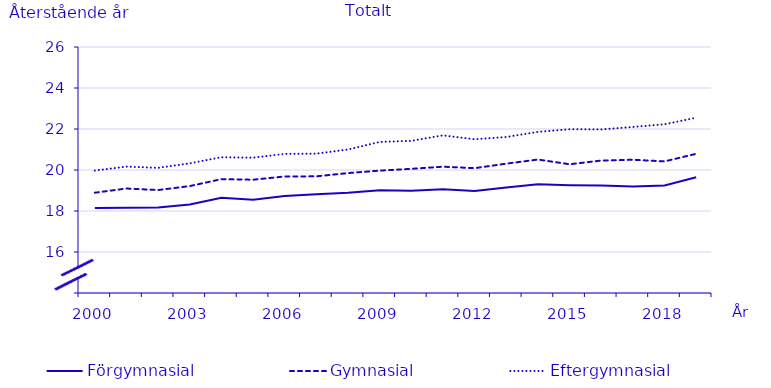
| Category | Förgymnasial | Gymnasial | Eftergymnasial |
|---|---|---|---|
| 2000.0 | 18.146 | 18.893 | 19.974 |
| 2001.0 | 18.158 | 19.096 | 20.164 |
| 2002.0 | 18.167 | 19.022 | 20.105 |
| 2003.0 | 18.318 | 19.216 | 20.325 |
| 2004.0 | 18.646 | 19.555 | 20.623 |
| 2005.0 | 18.552 | 19.526 | 20.6 |
| 2006.0 | 18.73 | 19.685 | 20.787 |
| 2007.0 | 18.817 | 19.691 | 20.798 |
| 2008.0 | 18.885 | 19.85 | 20.999 |
| 2009.0 | 19.016 | 19.969 | 21.369 |
| 2010.0 | 18.989 | 20.058 | 21.422 |
| 2011.0 | 19.066 | 20.161 | 21.69 |
| 2012.0 | 18.98 | 20.09 | 21.5 |
| 2013.0 | 19.15 | 20.31 | 21.61 |
| 2014.0 | 19.31 | 20.51 | 21.86 |
| 2015.0 | 19.26 | 20.28 | 21.99 |
| 2016.0 | 19.24 | 20.46 | 21.98 |
| 2017.0 | 19.2 | 20.5 | 22.1 |
| 2018.0 | 19.24 | 20.42 | 22.23 |
| 2019.0 | 19.65 | 20.79 | 22.55 |